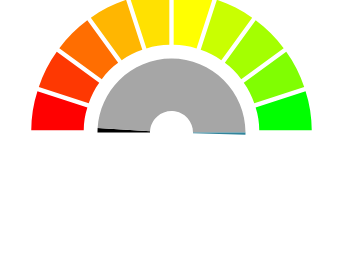
| Category | Series 0 | Series 1 |
|---|---|---|
| 0 | 0 | 10 |
| 1 | 0 | 10 |
| 2 | 2 | 10 |
| 3 | 99 | 10 |
| 4 | -1 | 10 |
| 5 | 0 | 10 |
| 6 | 0 | 10 |
| 7 | 0 | 10 |
| 8 | 0 | 10 |
| 9 | 0 | 10 |
| 10 | 100 | 100 |